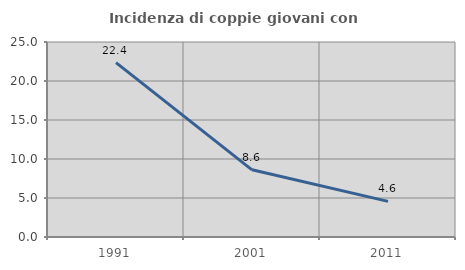
| Category | Incidenza di coppie giovani con figli |
|---|---|
| 1991.0 | 22.363 |
| 2001.0 | 8.614 |
| 2011.0 | 4.563 |